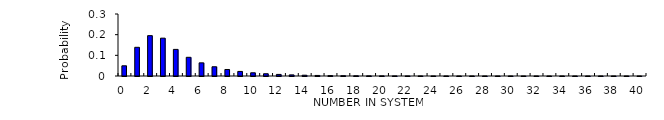
| Category | Series 0 |
|---|---|
| 0.0 | 0.049 |
| 1.0 | 0.139 |
| 2.0 | 0.195 |
| 3.0 | 0.183 |
| 4.0 | 0.129 |
| 5.0 | 0.09 |
| 6.0 | 0.064 |
| 7.0 | 0.045 |
| 8.0 | 0.031 |
| 9.0 | 0.022 |
| 10.0 | 0.016 |
| 11.0 | 0.011 |
| 12.0 | 0.008 |
| 13.0 | 0.005 |
| 14.0 | 0.004 |
| 15.0 | 0.003 |
| 16.0 | 0.002 |
| 17.0 | 0.001 |
| 18.0 | 0.001 |
| 19.0 | 0.001 |
| 20.0 | 0 |
| 21.0 | 0 |
| 22.0 | 0 |
| 23.0 | 0 |
| 24.0 | 0 |
| 25.0 | 0 |
| 26.0 | 0 |
| 27.0 | 0 |
| 28.0 | 0 |
| 29.0 | 0 |
| 30.0 | 0 |
| 31.0 | 0 |
| 32.0 | 0 |
| 33.0 | 0 |
| 34.0 | 0 |
| 35.0 | 0 |
| 36.0 | 0 |
| 37.0 | 0 |
| 38.0 | 0 |
| 39.0 | 0 |
| 40.0 | 0 |